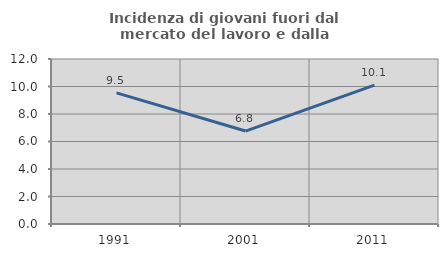
| Category | Incidenza di giovani fuori dal mercato del lavoro e dalla formazione  |
|---|---|
| 1991.0 | 9.535 |
| 2001.0 | 6.761 |
| 2011.0 | 10.098 |